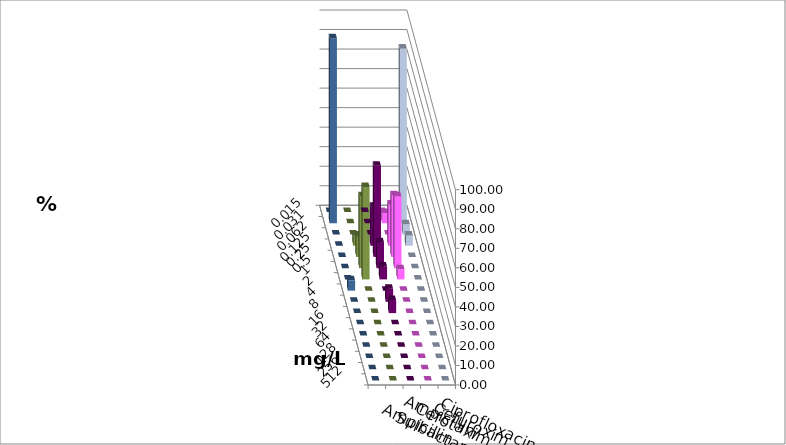
| Category | Ampicillin | Ampicillin/ Sulbactam | Cefotaxim | Cefuroxim | Ciprofloxacin |
|---|---|---|---|---|---|
| 0.015 | 0 | 0 | 0 | 0 | 0 |
| 0.031 | 0 | 5.263 | 89.474 | 0 | 94.737 |
| 0.062 | 0 | 0 | 5.263 | 0 | 0 |
| 0.125 | 20 | 21.053 | 5.263 | 5.263 | 0 |
| 0.25 | 46.667 | 31.579 | 0 | 10.526 | 0 |
| 0.5 | 13.333 | 36.842 | 0 | 36.842 | 0 |
| 1.0 | 6.667 | 5.263 | 0 | 47.368 | 0 |
| 2.0 | 0 | 0 | 0 | 0 | 5.263 |
| 4.0 | 6.667 | 0 | 0 | 0 | 0 |
| 8.0 | 6.667 | 0 | 0 | 0 | 0 |
| 16.0 | 0 | 0 | 0 | 0 | 0 |
| 32.0 | 0 | 0 | 0 | 0 | 0 |
| 64.0 | 0 | 0 | 0 | 0 | 0 |
| 128.0 | 0 | 0 | 0 | 0 | 0 |
| 256.0 | 0 | 0 | 0 | 0 | 0 |
| 512.0 | 0 | 0 | 0 | 0 | 0 |